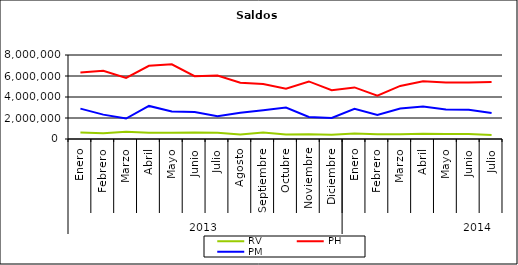
| Category | RV | PH | PM |
|---|---|---|---|
| 0 | 625726.624 | 6338490.057 | 2894951.851 |
| 1 | 552164.14 | 6505711.807 | 2320902.81 |
| 2 | 684317.675 | 5822855.149 | 1948127.804 |
| 3 | 601474.166 | 6976391.987 | 3151453.143 |
| 4 | 590050.657 | 7107878.906 | 2620515.735 |
| 5 | 624993.58 | 5975534.656 | 2574055.31 |
| 6 | 600696.535 | 6050025.472 | 2173848.831 |
| 7 | 419012.816 | 5367684.924 | 2503871.717 |
| 8 | 611730.758 | 5247250.768 | 2727549.288 |
| 9 | 419155.215 | 4784420.625 | 2990459.774 |
| 10 | 447319.577 | 5481772.72 | 2092491.866 |
| 11 | 408611.698 | 4646492.747 | 1999878.157 |
| 12 | 527889.485 | 4912075.273 | 2877652.76 |
| 13 | 454567.098 | 4120538.063 | 2278357.683 |
| 14 | 451499.2 | 5057360.029 | 2895505.472 |
| 15 | 496328.639 | 5498657.25 | 3083378.882 |
| 16 | 484463.452 | 5384146.137 | 2812191.042 |
| 17 | 465266.869 | 5373295.415 | 2775261.669 |
| 18 | 390003.439 | 5435984.925 | 2470327.976 |